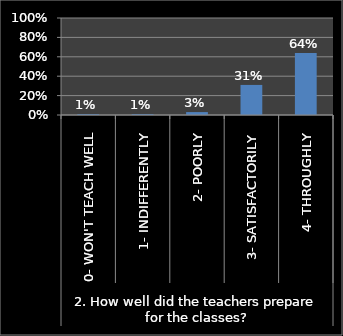
| Category | Series 0 |
|---|---|
| 0 | 0.01 |
| 1 | 0.01 |
| 2 | 0.03 |
| 3 | 0.31 |
| 4 | 0.64 |